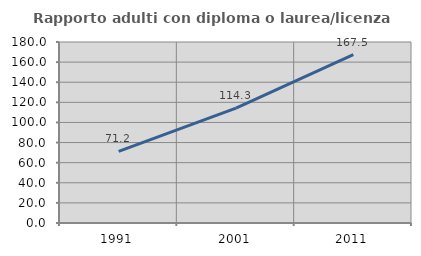
| Category | Rapporto adulti con diploma o laurea/licenza media  |
|---|---|
| 1991.0 | 71.189 |
| 2001.0 | 114.296 |
| 2011.0 | 167.525 |